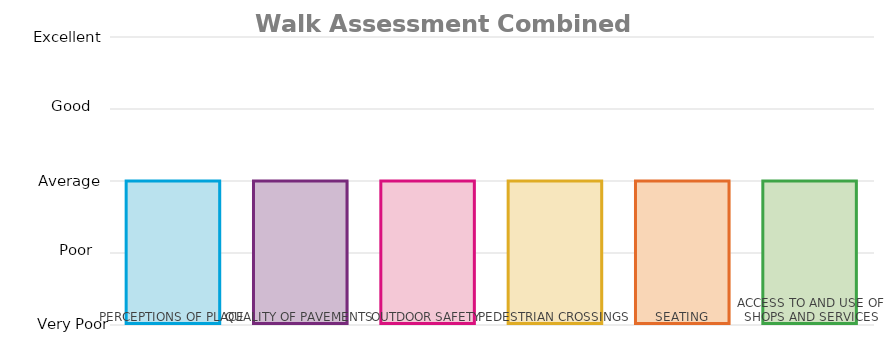
| Category | Combined Theme Averages |
|---|---|
| PERCEPTIONS OF PLACE | 2 |
| QUALITY OF PAVEMENTS | 2 |
| OUTDOOR SAFETY | 2 |
| PEDESTRIAN CROSSINGS | 2 |
| SEATING | 2 |
| ACCESS TO AND USE OF SHOPS AND SERVICES | 2 |